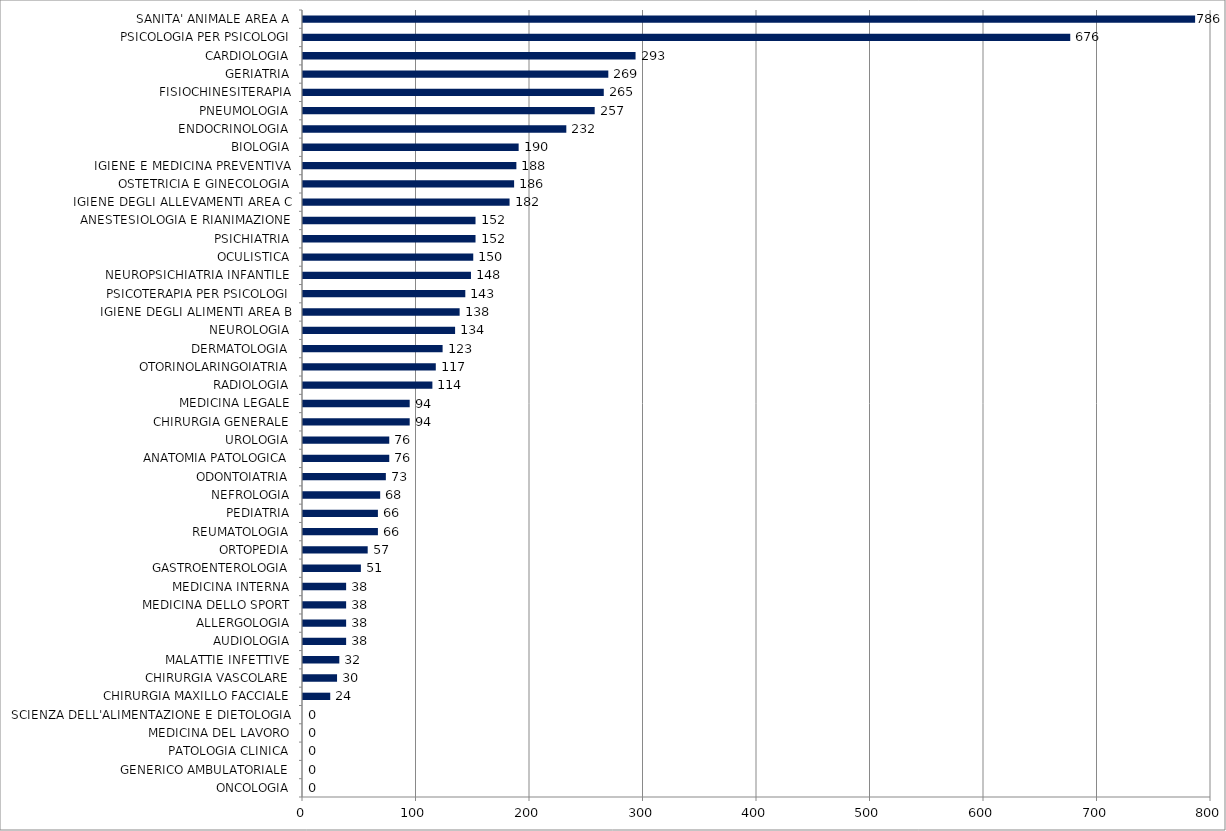
| Category | Series 0 |
|---|---|
| ONCOLOGIA | 0 |
| GENERICO AMBULATORIALE | 0 |
| PATOLOGIA CLINICA | 0 |
| MEDICINA DEL LAVORO | 0 |
| SCIENZA DELL'ALIMENTAZIONE E DIETOLOGIA | 0 |
| CHIRURGIA MAXILLO FACCIALE | 24 |
| CHIRURGIA VASCOLARE | 30 |
| MALATTIE INFETTIVE | 32 |
| AUDIOLOGIA | 38 |
| ALLERGOLOGIA | 38 |
| MEDICINA DELLO SPORT | 38 |
| MEDICINA INTERNA | 38 |
| GASTROENTEROLOGIA | 51 |
| ORTOPEDIA | 57 |
| REUMATOLOGIA | 66 |
| PEDIATRIA | 66 |
| NEFROLOGIA | 68 |
| ODONTOIATRIA | 73 |
| ANATOMIA PATOLOGICA | 76 |
| UROLOGIA | 76 |
| CHIRURGIA GENERALE | 94 |
| MEDICINA LEGALE | 94 |
| RADIOLOGIA | 114 |
| OTORINOLARINGOIATRIA | 117 |
| DERMATOLOGIA | 123 |
| NEUROLOGIA | 134 |
| IGIENE DEGLI ALIMENTI AREA B | 138 |
| PSICOTERAPIA PER PSICOLOGI | 143 |
| NEUROPSICHIATRIA INFANTILE | 148 |
| OCULISTICA | 150 |
| PSICHIATRIA | 152 |
| ANESTESIOLOGIA E RIANIMAZIONE | 152 |
| IGIENE DEGLI ALLEVAMENTI AREA C | 182 |
| OSTETRICIA E GINECOLOGIA | 186 |
| IGIENE E MEDICINA PREVENTIVA | 188 |
| BIOLOGIA | 190 |
| ENDOCRINOLOGIA | 232 |
| PNEUMOLOGIA | 257 |
| FISIOCHINESITERAPIA | 265 |
| GERIATRIA | 269 |
| CARDIOLOGIA | 293 |
| PSICOLOGIA PER PSICOLOGI | 676 |
| SANITA' ANIMALE AREA A | 786 |